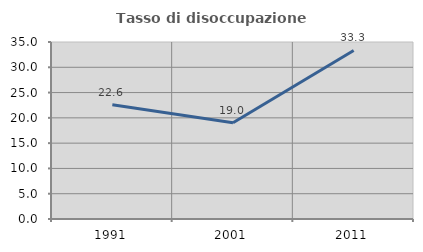
| Category | Tasso di disoccupazione giovanile  |
|---|---|
| 1991.0 | 22.581 |
| 2001.0 | 19.048 |
| 2011.0 | 33.333 |